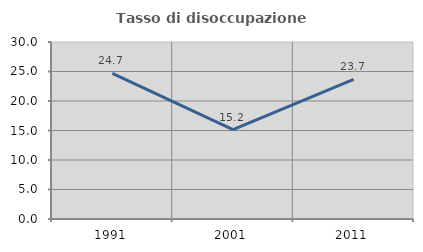
| Category | Tasso di disoccupazione giovanile  |
|---|---|
| 1991.0 | 24.691 |
| 2001.0 | 15.152 |
| 2011.0 | 23.684 |